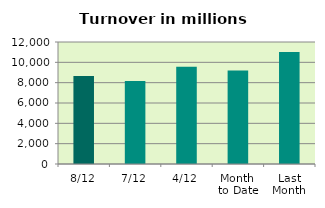
| Category | Series 0 |
|---|---|
| 8/12 | 8657.288 |
| 7/12 | 8171.334 |
| 4/12 | 9576.757 |
| Month 
to Date | 9188.766 |
| Last
Month | 11011.83 |